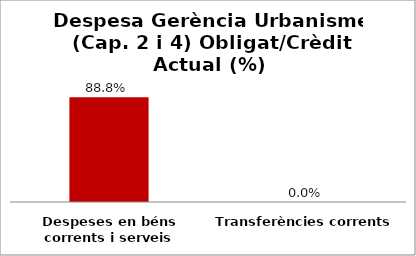
| Category | Series 0 |
|---|---|
| Despeses en béns corrents i serveis | 0.888 |
| Transferències corrents | 0 |